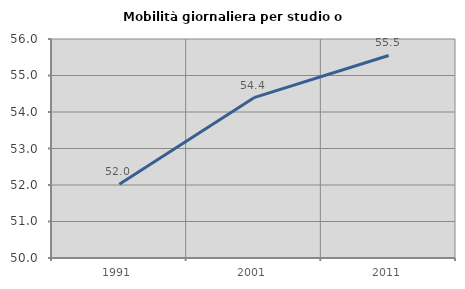
| Category | Mobilità giornaliera per studio o lavoro |
|---|---|
| 1991.0 | 52.019 |
| 2001.0 | 54.392 |
| 2011.0 | 55.549 |